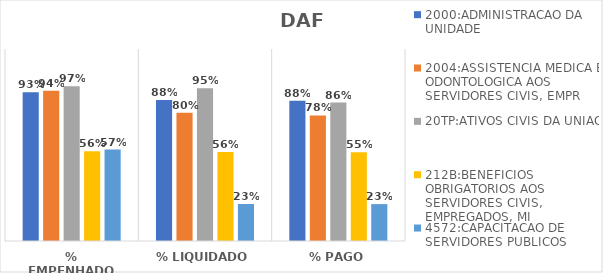
| Category | 2000:ADMINISTRACAO DA UNIDADE | 2004:ASSISTENCIA MEDICA E ODONTOLOGICA AOS SERVIDORES CIVIS, EMPR | 20TP:ATIVOS CIVIS DA UNIAO | 212B:BENEFICIOS OBRIGATORIOS AOS SERVIDORES CIVIS, EMPREGADOS, MI | 4572:CAPACITACAO DE SERVIDORES PUBLICOS FEDERAIS EM PROCESSO DE Q |
|---|---|---|---|---|---|
| % EMPENHADO | 0.929 | 0.939 | 0.967 | 0.56 | 0.571 |
| % LIQUIDADO | 0.881 | 0.801 | 0.955 | 0.556 | 0.231 |
| % PAGO | 0.877 | 0.785 | 0.865 | 0.555 | 0.231 |